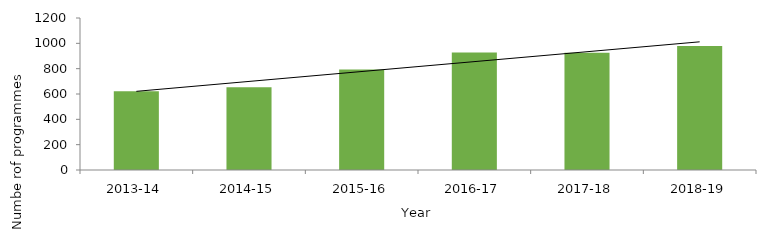
| Category | Series 0 |
|---|---|
| 2013-14 | 621 |
| 2014-15 | 653 |
| 2015-16 | 794 |
| 2016-17 | 927 |
| 2017-18 | 926 |
| 2018-19 | 978 |